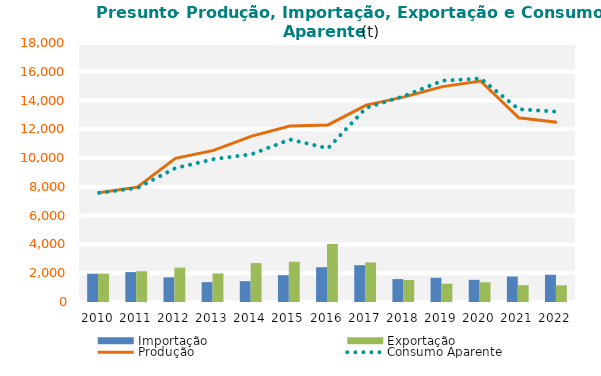
| Category | Importação | Exportação |
|---|---|---|
| 2010.0 | 1964.438 | 1968.612 |
| 2011.0 | 2077.955 | 2138.946 |
| 2012.0 | 1712.73 | 2389.578 |
| 2013.0 | 1377.775 | 1986.222 |
| 2014.0 | 1447.629 | 2704.849 |
| 2015.0 | 1863.586 | 2798.347 |
| 2016.0 | 2415.483 | 4037.502 |
| 2017.0 | 2560.694 | 2749.929 |
| 2018.0 | 1593.988 | 1528.027 |
| 2019.0 | 1683.208 | 1273.512 |
| 2020.0 | 1541.99 | 1369.942 |
| 2021.0 | 1771.744 | 1171.364 |
| 2022.0 | 1895.105 | 1162.922 |